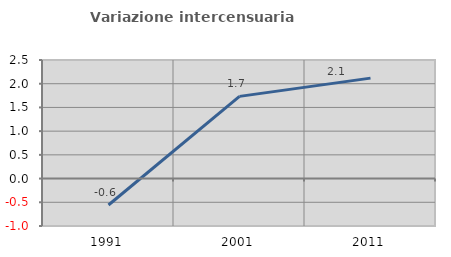
| Category | Variazione intercensuaria annua |
|---|---|
| 1991.0 | -0.557 |
| 2001.0 | 1.733 |
| 2011.0 | 2.118 |